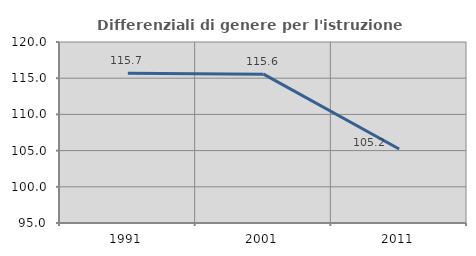
| Category | Differenziali di genere per l'istruzione superiore |
|---|---|
| 1991.0 | 115.698 |
| 2001.0 | 115.556 |
| 2011.0 | 105.215 |